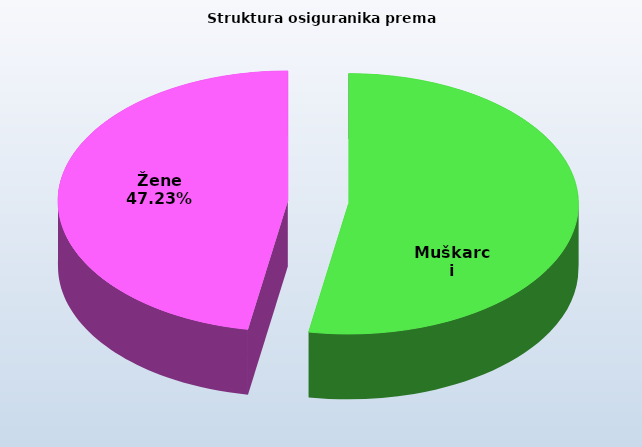
| Category | Series 0 |
|---|---|
| Muškarci | 844580 |
| Žene | 755825 |